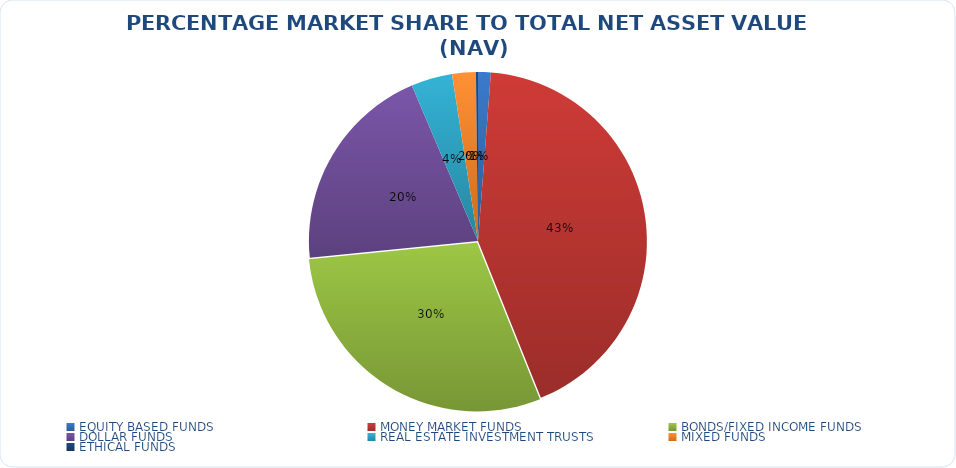
| Category | NET ASSET VALUE |
|---|---|
| EQUITY BASED FUNDS | 15528121718.95 |
| MONEY MARKET FUNDS | 543944712442 |
| BONDS/FIXED INCOME FUNDS | 375554593414.5 |
| DOLLAR FUNDS | 256903231714.805 |
| REAL ESTATE INVESTMENT TRUSTS | 50172900185.47 |
| MIXED FUNDS | 28863464828.69 |
| ETHICAL FUNDS | 2489850249.95 |